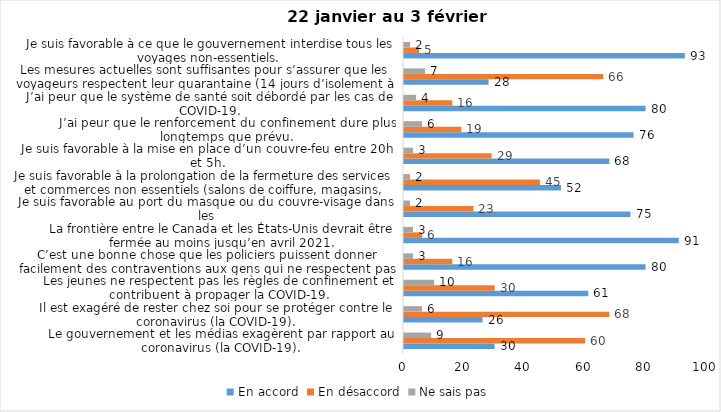
| Category | En accord | En désaccord | Ne sais pas |
|---|---|---|---|
| Le gouvernement et les médias exagèrent par rapport au coronavirus (la COVID-19). | 30 | 60 | 9 |
| Il est exagéré de rester chez soi pour se protéger contre le coronavirus (la COVID-19). | 26 | 68 | 6 |
| Les jeunes ne respectent pas les règles de confinement et contribuent à propager la COVID-19. | 61 | 30 | 10 |
| C’est une bonne chose que les policiers puissent donner facilement des contraventions aux gens qui ne respectent pas les mesures pour prévenir le coronavirus (la COVID-19). | 80 | 16 | 3 |
| La frontière entre le Canada et les États-Unis devrait être fermée au moins jusqu’en avril 2021. | 91 | 6 | 3 |
| Je suis favorable au port du masque ou du couvre-visage dans les
lieux publics extérieurs achalandés (ex. rues, parcs) | 75 | 23 | 2 |
| Je suis favorable à la prolongation de la fermeture des services et commerces non essentiels (salons de coiffure, magasins, industries) jusqu’au 8 février. | 52 | 45 | 2 |
| Je suis favorable à la mise en place d’un couvre-feu entre 20h et 5h. | 68 | 29 | 3 |
| J’ai peur que le renforcement du confinement dure plus longtemps que prévu. | 76 | 19 | 6 |
| J’ai peur que le système de santé soit débordé par les cas de COVID-19. | 80 | 16 | 4 |
| Les mesures actuelles sont suffisantes pour s’assurer que les voyageurs respectent leur quarantaine (14 jours d’isolement à la maison au retour d’un voyage). | 28 | 66 | 7 |
| Je suis favorable à ce que le gouvernement interdise tous les voyages non-essentiels. | 93 | 5 | 2 |